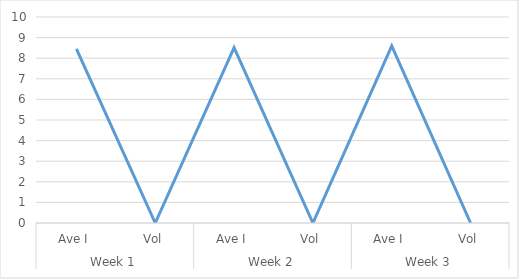
| Category | Series 0 |
|---|---|
| 0 | 8.457 |
| 1 | 0 |
| 2 | 8.514 |
| 3 | 0 |
| 4 | 8.6 |
| 5 | 0 |